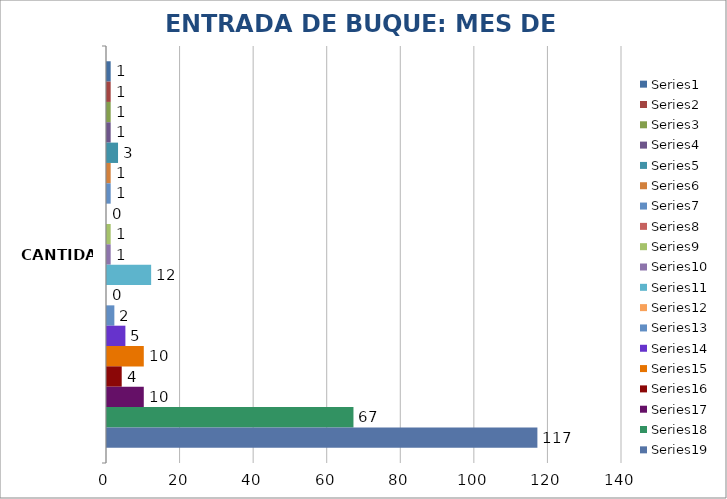
| Category | Series 0 | Series 1 | Series 2 | Series 3 | Series 4 | Series 5 | Series 6 | Series 7 | Series 8 | Series 9 | Series 10 | Series 11 | Series 12 | Series 13 | Series 14 | Series 15 | Series 16 | Series 17 | Series 18 |
|---|---|---|---|---|---|---|---|---|---|---|---|---|---|---|---|---|---|---|---|
| CANTIDAD | 1 | 1 | 1 | 1 | 3 | 1 | 1 | 0 | 1 | 1 | 12 | 0 | 2 | 5 | 10 | 4 | 10 | 67 | 117 |